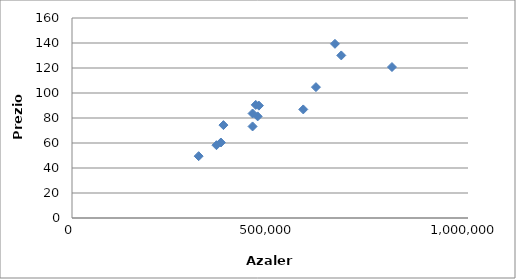
| Category | Azalera |
|---|---|
| 319840.0 | 49.47 |
| 364800.0 | 58.25 |
| 376000.0 | 60.39 |
| 456000.0 | 73.25 |
| 382400.0 | 74.32 |
| 468800.0 | 81.29 |
| 456000.0 | 83.61 |
| 584000.0 | 86.86 |
| 472000.0 | 89.88 |
| 464000.0 | 90.49 |
| 616000.0 | 104.7 |
| 808000.0 | 120.77 |
| 680000.0 | 130.06 |
| 664000.0 | 139.35 |